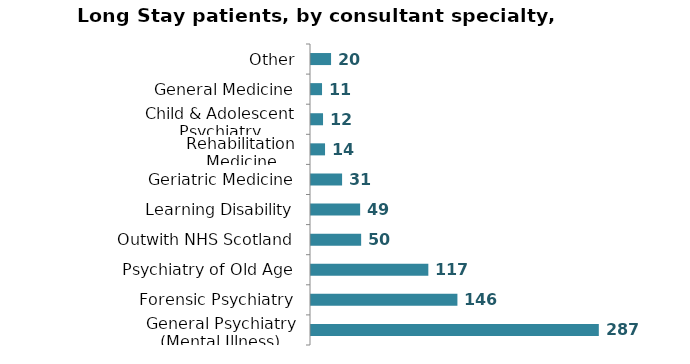
| Category | Series 0 |
|---|---|
| General Psychiatry (Mental Illness) | 287 |
| Forensic Psychiatry | 146 |
| Psychiatry of Old Age | 117 |
| Outwith NHS Scotland | 50 |
| Learning Disability | 49 |
| Geriatric Medicine | 31 |
| Rehabilitation Medicine | 14 |
| Child & Adolescent Psychiatry | 12 |
| General Medicine | 11 |
| Other | 20 |